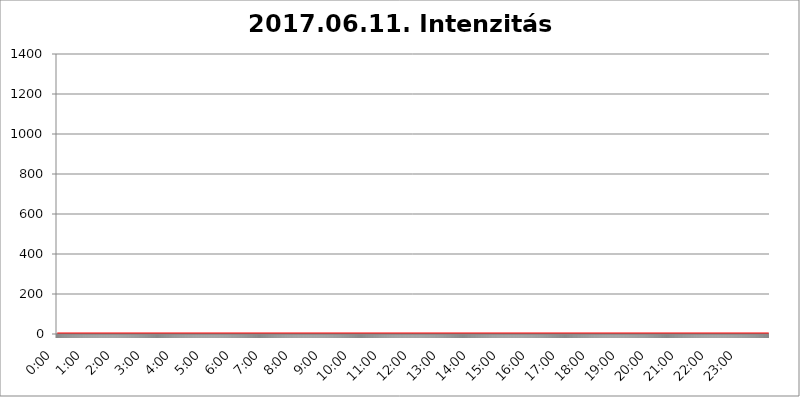
| Category | 2017.06.11. Intenzitás [W/m^2]04 |
|---|---|
| 0.0 | 0 |
| 0.0006944444444444445 | 0 |
| 0.001388888888888889 | 0 |
| 0.0020833333333333333 | 0 |
| 0.002777777777777778 | 0 |
| 0.003472222222222222 | 0 |
| 0.004166666666666667 | 0 |
| 0.004861111111111111 | 0 |
| 0.005555555555555556 | 0 |
| 0.0062499999999999995 | 0 |
| 0.006944444444444444 | 0 |
| 0.007638888888888889 | 0 |
| 0.008333333333333333 | 0 |
| 0.009027777777777779 | 0 |
| 0.009722222222222222 | 0 |
| 0.010416666666666666 | 0 |
| 0.011111111111111112 | 0 |
| 0.011805555555555555 | 0 |
| 0.012499999999999999 | 0 |
| 0.013194444444444444 | 0 |
| 0.013888888888888888 | 0 |
| 0.014583333333333332 | 0 |
| 0.015277777777777777 | 0 |
| 0.015972222222222224 | 0 |
| 0.016666666666666666 | 0 |
| 0.017361111111111112 | 0 |
| 0.018055555555555557 | 0 |
| 0.01875 | 0 |
| 0.019444444444444445 | 0 |
| 0.02013888888888889 | 0 |
| 0.020833333333333332 | 0 |
| 0.02152777777777778 | 0 |
| 0.022222222222222223 | 0 |
| 0.02291666666666667 | 0 |
| 0.02361111111111111 | 0 |
| 0.024305555555555556 | 0 |
| 0.024999999999999998 | 0 |
| 0.025694444444444447 | 0 |
| 0.02638888888888889 | 0 |
| 0.027083333333333334 | 0 |
| 0.027777777777777776 | 0 |
| 0.02847222222222222 | 0 |
| 0.029166666666666664 | 0 |
| 0.029861111111111113 | 0 |
| 0.030555555555555555 | 0 |
| 0.03125 | 0 |
| 0.03194444444444445 | 0 |
| 0.03263888888888889 | 0 |
| 0.03333333333333333 | 0 |
| 0.034027777777777775 | 0 |
| 0.034722222222222224 | 0 |
| 0.035416666666666666 | 0 |
| 0.036111111111111115 | 0 |
| 0.03680555555555556 | 0 |
| 0.0375 | 0 |
| 0.03819444444444444 | 0 |
| 0.03888888888888889 | 0 |
| 0.03958333333333333 | 0 |
| 0.04027777777777778 | 0 |
| 0.04097222222222222 | 0 |
| 0.041666666666666664 | 0 |
| 0.042361111111111106 | 0 |
| 0.04305555555555556 | 0 |
| 0.043750000000000004 | 0 |
| 0.044444444444444446 | 0 |
| 0.04513888888888889 | 0 |
| 0.04583333333333334 | 0 |
| 0.04652777777777778 | 0 |
| 0.04722222222222222 | 0 |
| 0.04791666666666666 | 0 |
| 0.04861111111111111 | 0 |
| 0.049305555555555554 | 0 |
| 0.049999999999999996 | 0 |
| 0.05069444444444445 | 0 |
| 0.051388888888888894 | 0 |
| 0.052083333333333336 | 0 |
| 0.05277777777777778 | 0 |
| 0.05347222222222222 | 0 |
| 0.05416666666666667 | 0 |
| 0.05486111111111111 | 0 |
| 0.05555555555555555 | 0 |
| 0.05625 | 0 |
| 0.05694444444444444 | 0 |
| 0.057638888888888885 | 0 |
| 0.05833333333333333 | 0 |
| 0.05902777777777778 | 0 |
| 0.059722222222222225 | 0 |
| 0.06041666666666667 | 0 |
| 0.061111111111111116 | 0 |
| 0.06180555555555556 | 0 |
| 0.0625 | 0 |
| 0.06319444444444444 | 0 |
| 0.06388888888888888 | 0 |
| 0.06458333333333334 | 0 |
| 0.06527777777777778 | 0 |
| 0.06597222222222222 | 0 |
| 0.06666666666666667 | 0 |
| 0.06736111111111111 | 0 |
| 0.06805555555555555 | 0 |
| 0.06874999999999999 | 0 |
| 0.06944444444444443 | 0 |
| 0.07013888888888889 | 0 |
| 0.07083333333333333 | 0 |
| 0.07152777777777779 | 0 |
| 0.07222222222222223 | 0 |
| 0.07291666666666667 | 0 |
| 0.07361111111111111 | 0 |
| 0.07430555555555556 | 0 |
| 0.075 | 0 |
| 0.07569444444444444 | 0 |
| 0.0763888888888889 | 0 |
| 0.07708333333333334 | 0 |
| 0.07777777777777778 | 0 |
| 0.07847222222222222 | 0 |
| 0.07916666666666666 | 0 |
| 0.0798611111111111 | 0 |
| 0.08055555555555556 | 0 |
| 0.08125 | 0 |
| 0.08194444444444444 | 0 |
| 0.08263888888888889 | 0 |
| 0.08333333333333333 | 0 |
| 0.08402777777777777 | 0 |
| 0.08472222222222221 | 0 |
| 0.08541666666666665 | 0 |
| 0.08611111111111112 | 0 |
| 0.08680555555555557 | 0 |
| 0.08750000000000001 | 0 |
| 0.08819444444444445 | 0 |
| 0.08888888888888889 | 0 |
| 0.08958333333333333 | 0 |
| 0.09027777777777778 | 0 |
| 0.09097222222222222 | 0 |
| 0.09166666666666667 | 0 |
| 0.09236111111111112 | 0 |
| 0.09305555555555556 | 0 |
| 0.09375 | 0 |
| 0.09444444444444444 | 0 |
| 0.09513888888888888 | 0 |
| 0.09583333333333333 | 0 |
| 0.09652777777777777 | 0 |
| 0.09722222222222222 | 0 |
| 0.09791666666666667 | 0 |
| 0.09861111111111111 | 0 |
| 0.09930555555555555 | 0 |
| 0.09999999999999999 | 0 |
| 0.10069444444444443 | 0 |
| 0.1013888888888889 | 0 |
| 0.10208333333333335 | 0 |
| 0.10277777777777779 | 0 |
| 0.10347222222222223 | 0 |
| 0.10416666666666667 | 0 |
| 0.10486111111111111 | 0 |
| 0.10555555555555556 | 0 |
| 0.10625 | 0 |
| 0.10694444444444444 | 0 |
| 0.1076388888888889 | 0 |
| 0.10833333333333334 | 0 |
| 0.10902777777777778 | 0 |
| 0.10972222222222222 | 0 |
| 0.1111111111111111 | 0 |
| 0.11180555555555556 | 0 |
| 0.11180555555555556 | 0 |
| 0.1125 | 0 |
| 0.11319444444444444 | 0 |
| 0.11388888888888889 | 0 |
| 0.11458333333333333 | 0 |
| 0.11527777777777777 | 0 |
| 0.11597222222222221 | 0 |
| 0.11666666666666665 | 0 |
| 0.1173611111111111 | 0 |
| 0.11805555555555557 | 0 |
| 0.11944444444444445 | 0 |
| 0.12013888888888889 | 0 |
| 0.12083333333333333 | 0 |
| 0.12152777777777778 | 0 |
| 0.12222222222222223 | 0 |
| 0.12291666666666667 | 0 |
| 0.12291666666666667 | 0 |
| 0.12361111111111112 | 0 |
| 0.12430555555555556 | 0 |
| 0.125 | 0 |
| 0.12569444444444444 | 0 |
| 0.12638888888888888 | 0 |
| 0.12708333333333333 | 0 |
| 0.16875 | 0 |
| 0.12847222222222224 | 0 |
| 0.12916666666666668 | 0 |
| 0.12986111111111112 | 0 |
| 0.13055555555555556 | 0 |
| 0.13125 | 0 |
| 0.13194444444444445 | 0 |
| 0.1326388888888889 | 0 |
| 0.13333333333333333 | 0 |
| 0.13402777777777777 | 0 |
| 0.13402777777777777 | 0 |
| 0.13472222222222222 | 0 |
| 0.13541666666666666 | 0 |
| 0.1361111111111111 | 0 |
| 0.13749999999999998 | 0 |
| 0.13819444444444443 | 0 |
| 0.1388888888888889 | 0 |
| 0.13958333333333334 | 0 |
| 0.14027777777777778 | 0 |
| 0.14097222222222222 | 0 |
| 0.14166666666666666 | 0 |
| 0.1423611111111111 | 0 |
| 0.14305555555555557 | 0 |
| 0.14375000000000002 | 0 |
| 0.14444444444444446 | 0 |
| 0.1451388888888889 | 0 |
| 0.1451388888888889 | 0 |
| 0.14652777777777778 | 0 |
| 0.14722222222222223 | 0 |
| 0.14791666666666667 | 0 |
| 0.1486111111111111 | 0 |
| 0.14930555555555555 | 0 |
| 0.15 | 0 |
| 0.15069444444444444 | 0 |
| 0.15138888888888888 | 0 |
| 0.15208333333333332 | 0 |
| 0.15277777777777776 | 0 |
| 0.15347222222222223 | 0 |
| 0.15416666666666667 | 0 |
| 0.15486111111111112 | 0 |
| 0.15555555555555556 | 0 |
| 0.15625 | 0 |
| 0.15694444444444444 | 0 |
| 0.15763888888888888 | 0 |
| 0.15833333333333333 | 0 |
| 0.15902777777777777 | 0 |
| 0.15972222222222224 | 0 |
| 0.16041666666666668 | 0 |
| 0.16111111111111112 | 0 |
| 0.16180555555555556 | 0 |
| 0.1625 | 0 |
| 0.16319444444444445 | 0 |
| 0.1638888888888889 | 0 |
| 0.16458333333333333 | 0 |
| 0.16527777777777777 | 0 |
| 0.16597222222222222 | 0 |
| 0.16666666666666666 | 0 |
| 0.1673611111111111 | 0 |
| 0.16805555555555554 | 0 |
| 0.16874999999999998 | 0 |
| 0.16944444444444443 | 0 |
| 0.17013888888888887 | 0 |
| 0.1708333333333333 | 0 |
| 0.17152777777777775 | 0 |
| 0.17222222222222225 | 0 |
| 0.1729166666666667 | 0 |
| 0.17361111111111113 | 0 |
| 0.17430555555555557 | 0 |
| 0.17500000000000002 | 0 |
| 0.17569444444444446 | 0 |
| 0.1763888888888889 | 0 |
| 0.17708333333333334 | 0 |
| 0.17777777777777778 | 0 |
| 0.17847222222222223 | 0 |
| 0.17916666666666667 | 0 |
| 0.1798611111111111 | 0 |
| 0.18055555555555555 | 0 |
| 0.18125 | 0 |
| 0.18194444444444444 | 0 |
| 0.1826388888888889 | 0 |
| 0.18333333333333335 | 0 |
| 0.1840277777777778 | 0 |
| 0.18472222222222223 | 0 |
| 0.18541666666666667 | 0 |
| 0.18611111111111112 | 0 |
| 0.18680555555555556 | 0 |
| 0.1875 | 0 |
| 0.18819444444444444 | 0 |
| 0.18888888888888888 | 0 |
| 0.18958333333333333 | 0 |
| 0.19027777777777777 | 0 |
| 0.1909722222222222 | 0 |
| 0.19166666666666665 | 0 |
| 0.19236111111111112 | 0 |
| 0.19305555555555554 | 0 |
| 0.19375 | 0 |
| 0.19444444444444445 | 0 |
| 0.1951388888888889 | 0 |
| 0.19583333333333333 | 0 |
| 0.19652777777777777 | 0 |
| 0.19722222222222222 | 0 |
| 0.19791666666666666 | 0 |
| 0.1986111111111111 | 0 |
| 0.19930555555555554 | 0 |
| 0.19999999999999998 | 0 |
| 0.20069444444444443 | 0 |
| 0.20138888888888887 | 0 |
| 0.2020833333333333 | 0 |
| 0.2027777777777778 | 0 |
| 0.2034722222222222 | 0 |
| 0.2041666666666667 | 0 |
| 0.20486111111111113 | 0 |
| 0.20555555555555557 | 0 |
| 0.20625000000000002 | 0 |
| 0.20694444444444446 | 0 |
| 0.2076388888888889 | 0 |
| 0.20833333333333334 | 0 |
| 0.20902777777777778 | 0 |
| 0.20972222222222223 | 0 |
| 0.21041666666666667 | 0 |
| 0.2111111111111111 | 0 |
| 0.21180555555555555 | 0 |
| 0.2125 | 0 |
| 0.21319444444444444 | 0 |
| 0.2138888888888889 | 0 |
| 0.21458333333333335 | 0 |
| 0.2152777777777778 | 0 |
| 0.21597222222222223 | 0 |
| 0.21666666666666667 | 0 |
| 0.21736111111111112 | 0 |
| 0.21805555555555556 | 0 |
| 0.21875 | 0 |
| 0.21944444444444444 | 0 |
| 0.22013888888888888 | 0 |
| 0.22083333333333333 | 0 |
| 0.22152777777777777 | 0 |
| 0.2222222222222222 | 0 |
| 0.22291666666666665 | 0 |
| 0.2236111111111111 | 0 |
| 0.22430555555555556 | 0 |
| 0.225 | 0 |
| 0.22569444444444445 | 0 |
| 0.2263888888888889 | 0 |
| 0.22708333333333333 | 0 |
| 0.22777777777777777 | 0 |
| 0.22847222222222222 | 0 |
| 0.22916666666666666 | 0 |
| 0.2298611111111111 | 0 |
| 0.23055555555555554 | 0 |
| 0.23124999999999998 | 0 |
| 0.23194444444444443 | 0 |
| 0.23263888888888887 | 0 |
| 0.2333333333333333 | 0 |
| 0.2340277777777778 | 0 |
| 0.2347222222222222 | 0 |
| 0.2354166666666667 | 0 |
| 0.23611111111111113 | 0 |
| 0.23680555555555557 | 0 |
| 0.23750000000000002 | 0 |
| 0.23819444444444446 | 0 |
| 0.2388888888888889 | 0 |
| 0.23958333333333334 | 0 |
| 0.24027777777777778 | 0 |
| 0.24097222222222223 | 0 |
| 0.24166666666666667 | 0 |
| 0.2423611111111111 | 0 |
| 0.24305555555555555 | 0 |
| 0.24375 | 0 |
| 0.24444444444444446 | 0 |
| 0.24513888888888888 | 0 |
| 0.24583333333333335 | 0 |
| 0.2465277777777778 | 0 |
| 0.24722222222222223 | 0 |
| 0.24791666666666667 | 0 |
| 0.24861111111111112 | 0 |
| 0.24930555555555556 | 0 |
| 0.25 | 0 |
| 0.25069444444444444 | 0 |
| 0.2513888888888889 | 0 |
| 0.2520833333333333 | 0 |
| 0.25277777777777777 | 0 |
| 0.2534722222222222 | 0 |
| 0.25416666666666665 | 0 |
| 0.2548611111111111 | 0 |
| 0.2555555555555556 | 0 |
| 0.25625000000000003 | 0 |
| 0.2569444444444445 | 0 |
| 0.2576388888888889 | 0 |
| 0.25833333333333336 | 0 |
| 0.2590277777777778 | 0 |
| 0.25972222222222224 | 0 |
| 0.2604166666666667 | 0 |
| 0.2611111111111111 | 0 |
| 0.26180555555555557 | 0 |
| 0.2625 | 0 |
| 0.26319444444444445 | 0 |
| 0.2638888888888889 | 0 |
| 0.26458333333333334 | 0 |
| 0.2652777777777778 | 0 |
| 0.2659722222222222 | 0 |
| 0.26666666666666666 | 0 |
| 0.2673611111111111 | 0 |
| 0.26805555555555555 | 0 |
| 0.26875 | 0 |
| 0.26944444444444443 | 0 |
| 0.2701388888888889 | 0 |
| 0.2708333333333333 | 0 |
| 0.27152777777777776 | 0 |
| 0.2722222222222222 | 0 |
| 0.27291666666666664 | 0 |
| 0.2736111111111111 | 0 |
| 0.2743055555555555 | 0 |
| 0.27499999999999997 | 0 |
| 0.27569444444444446 | 0 |
| 0.27638888888888885 | 0 |
| 0.27708333333333335 | 0 |
| 0.2777777777777778 | 0 |
| 0.27847222222222223 | 0 |
| 0.2791666666666667 | 0 |
| 0.2798611111111111 | 0 |
| 0.28055555555555556 | 0 |
| 0.28125 | 0 |
| 0.28194444444444444 | 0 |
| 0.2826388888888889 | 0 |
| 0.2833333333333333 | 0 |
| 0.28402777777777777 | 0 |
| 0.2847222222222222 | 0 |
| 0.28541666666666665 | 0 |
| 0.28611111111111115 | 0 |
| 0.28680555555555554 | 0 |
| 0.28750000000000003 | 0 |
| 0.2881944444444445 | 0 |
| 0.2888888888888889 | 0 |
| 0.28958333333333336 | 0 |
| 0.2902777777777778 | 0 |
| 0.29097222222222224 | 0 |
| 0.2916666666666667 | 0 |
| 0.2923611111111111 | 0 |
| 0.29305555555555557 | 0 |
| 0.29375 | 0 |
| 0.29444444444444445 | 0 |
| 0.2951388888888889 | 0 |
| 0.29583333333333334 | 0 |
| 0.2965277777777778 | 0 |
| 0.2972222222222222 | 0 |
| 0.29791666666666666 | 0 |
| 0.2986111111111111 | 0 |
| 0.29930555555555555 | 0 |
| 0.3 | 0 |
| 0.30069444444444443 | 0 |
| 0.3013888888888889 | 0 |
| 0.3020833333333333 | 0 |
| 0.30277777777777776 | 0 |
| 0.3034722222222222 | 0 |
| 0.30416666666666664 | 0 |
| 0.3048611111111111 | 0 |
| 0.3055555555555555 | 0 |
| 0.30624999999999997 | 0 |
| 0.3069444444444444 | 0 |
| 0.3076388888888889 | 0 |
| 0.30833333333333335 | 0 |
| 0.3090277777777778 | 0 |
| 0.30972222222222223 | 0 |
| 0.3104166666666667 | 0 |
| 0.3111111111111111 | 0 |
| 0.31180555555555556 | 0 |
| 0.3125 | 0 |
| 0.31319444444444444 | 0 |
| 0.3138888888888889 | 0 |
| 0.3145833333333333 | 0 |
| 0.31527777777777777 | 0 |
| 0.3159722222222222 | 0 |
| 0.31666666666666665 | 0 |
| 0.31736111111111115 | 0 |
| 0.31805555555555554 | 0 |
| 0.31875000000000003 | 0 |
| 0.3194444444444445 | 0 |
| 0.3201388888888889 | 0 |
| 0.32083333333333336 | 0 |
| 0.3215277777777778 | 0 |
| 0.32222222222222224 | 0 |
| 0.3229166666666667 | 0 |
| 0.3236111111111111 | 0 |
| 0.32430555555555557 | 0 |
| 0.325 | 0 |
| 0.32569444444444445 | 0 |
| 0.3263888888888889 | 0 |
| 0.32708333333333334 | 0 |
| 0.3277777777777778 | 0 |
| 0.3284722222222222 | 0 |
| 0.32916666666666666 | 0 |
| 0.3298611111111111 | 0 |
| 0.33055555555555555 | 0 |
| 0.33125 | 0 |
| 0.33194444444444443 | 0 |
| 0.3326388888888889 | 0 |
| 0.3333333333333333 | 0 |
| 0.3340277777777778 | 0 |
| 0.3347222222222222 | 0 |
| 0.3354166666666667 | 0 |
| 0.3361111111111111 | 0 |
| 0.3368055555555556 | 0 |
| 0.33749999999999997 | 0 |
| 0.33819444444444446 | 0 |
| 0.33888888888888885 | 0 |
| 0.33958333333333335 | 0 |
| 0.34027777777777773 | 0 |
| 0.34097222222222223 | 0 |
| 0.3416666666666666 | 0 |
| 0.3423611111111111 | 0 |
| 0.3430555555555555 | 0 |
| 0.34375 | 0 |
| 0.3444444444444445 | 0 |
| 0.3451388888888889 | 0 |
| 0.3458333333333334 | 0 |
| 0.34652777777777777 | 0 |
| 0.34722222222222227 | 0 |
| 0.34791666666666665 | 0 |
| 0.34861111111111115 | 0 |
| 0.34930555555555554 | 0 |
| 0.35000000000000003 | 0 |
| 0.3506944444444444 | 0 |
| 0.3513888888888889 | 0 |
| 0.3520833333333333 | 0 |
| 0.3527777777777778 | 0 |
| 0.3534722222222222 | 0 |
| 0.3541666666666667 | 0 |
| 0.3548611111111111 | 0 |
| 0.35555555555555557 | 0 |
| 0.35625 | 0 |
| 0.35694444444444445 | 0 |
| 0.3576388888888889 | 0 |
| 0.35833333333333334 | 0 |
| 0.3590277777777778 | 0 |
| 0.3597222222222222 | 0 |
| 0.36041666666666666 | 0 |
| 0.3611111111111111 | 0 |
| 0.36180555555555555 | 0 |
| 0.3625 | 0 |
| 0.36319444444444443 | 0 |
| 0.3638888888888889 | 0 |
| 0.3645833333333333 | 0 |
| 0.3652777777777778 | 0 |
| 0.3659722222222222 | 0 |
| 0.3666666666666667 | 0 |
| 0.3673611111111111 | 0 |
| 0.3680555555555556 | 0 |
| 0.36874999999999997 | 0 |
| 0.36944444444444446 | 0 |
| 0.37013888888888885 | 0 |
| 0.37083333333333335 | 0 |
| 0.37152777777777773 | 0 |
| 0.37222222222222223 | 0 |
| 0.3729166666666666 | 0 |
| 0.3736111111111111 | 0 |
| 0.3743055555555555 | 0 |
| 0.375 | 0 |
| 0.3756944444444445 | 0 |
| 0.3763888888888889 | 0 |
| 0.3770833333333334 | 0 |
| 0.37777777777777777 | 0 |
| 0.37847222222222227 | 0 |
| 0.37916666666666665 | 0 |
| 0.37986111111111115 | 0 |
| 0.38055555555555554 | 0 |
| 0.38125000000000003 | 0 |
| 0.3819444444444444 | 0 |
| 0.3826388888888889 | 0 |
| 0.3833333333333333 | 0 |
| 0.3840277777777778 | 0 |
| 0.3847222222222222 | 0 |
| 0.3854166666666667 | 0 |
| 0.3861111111111111 | 0 |
| 0.38680555555555557 | 0 |
| 0.3875 | 0 |
| 0.38819444444444445 | 0 |
| 0.3888888888888889 | 0 |
| 0.38958333333333334 | 0 |
| 0.3902777777777778 | 0 |
| 0.3909722222222222 | 0 |
| 0.39166666666666666 | 0 |
| 0.3923611111111111 | 0 |
| 0.39305555555555555 | 0 |
| 0.39375 | 0 |
| 0.39444444444444443 | 0 |
| 0.3951388888888889 | 0 |
| 0.3958333333333333 | 0 |
| 0.3965277777777778 | 0 |
| 0.3972222222222222 | 0 |
| 0.3979166666666667 | 0 |
| 0.3986111111111111 | 0 |
| 0.3993055555555556 | 0 |
| 0.39999999999999997 | 0 |
| 0.40069444444444446 | 0 |
| 0.40138888888888885 | 0 |
| 0.40208333333333335 | 0 |
| 0.40277777777777773 | 0 |
| 0.40347222222222223 | 0 |
| 0.4041666666666666 | 0 |
| 0.4048611111111111 | 0 |
| 0.4055555555555555 | 0 |
| 0.40625 | 0 |
| 0.4069444444444445 | 0 |
| 0.4076388888888889 | 0 |
| 0.4083333333333334 | 0 |
| 0.40902777777777777 | 0 |
| 0.40972222222222227 | 0 |
| 0.41041666666666665 | 0 |
| 0.41111111111111115 | 0 |
| 0.41180555555555554 | 0 |
| 0.41250000000000003 | 0 |
| 0.4131944444444444 | 0 |
| 0.4138888888888889 | 0 |
| 0.4145833333333333 | 0 |
| 0.4152777777777778 | 0 |
| 0.4159722222222222 | 0 |
| 0.4166666666666667 | 0 |
| 0.4173611111111111 | 0 |
| 0.41805555555555557 | 0 |
| 0.41875 | 0 |
| 0.41944444444444445 | 0 |
| 0.4201388888888889 | 0 |
| 0.42083333333333334 | 0 |
| 0.4215277777777778 | 0 |
| 0.4222222222222222 | 0 |
| 0.42291666666666666 | 0 |
| 0.4236111111111111 | 0 |
| 0.42430555555555555 | 0 |
| 0.425 | 0 |
| 0.42569444444444443 | 0 |
| 0.4263888888888889 | 0 |
| 0.4270833333333333 | 0 |
| 0.4277777777777778 | 0 |
| 0.4284722222222222 | 0 |
| 0.4291666666666667 | 0 |
| 0.4298611111111111 | 0 |
| 0.4305555555555556 | 0 |
| 0.43124999999999997 | 0 |
| 0.43194444444444446 | 0 |
| 0.43263888888888885 | 0 |
| 0.43333333333333335 | 0 |
| 0.43402777777777773 | 0 |
| 0.43472222222222223 | 0 |
| 0.4354166666666666 | 0 |
| 0.4361111111111111 | 0 |
| 0.4368055555555555 | 0 |
| 0.4375 | 0 |
| 0.4381944444444445 | 0 |
| 0.4388888888888889 | 0 |
| 0.4395833333333334 | 0 |
| 0.44027777777777777 | 0 |
| 0.44097222222222227 | 0 |
| 0.44166666666666665 | 0 |
| 0.44236111111111115 | 0 |
| 0.44305555555555554 | 0 |
| 0.44375000000000003 | 0 |
| 0.4444444444444444 | 0 |
| 0.4451388888888889 | 0 |
| 0.4458333333333333 | 0 |
| 0.4465277777777778 | 0 |
| 0.4472222222222222 | 0 |
| 0.4479166666666667 | 0 |
| 0.4486111111111111 | 0 |
| 0.44930555555555557 | 0 |
| 0.45 | 0 |
| 0.45069444444444445 | 0 |
| 0.4513888888888889 | 0 |
| 0.45208333333333334 | 0 |
| 0.4527777777777778 | 0 |
| 0.4534722222222222 | 0 |
| 0.45416666666666666 | 0 |
| 0.4548611111111111 | 0 |
| 0.45555555555555555 | 0 |
| 0.45625 | 0 |
| 0.45694444444444443 | 0 |
| 0.4576388888888889 | 0 |
| 0.4583333333333333 | 0 |
| 0.4590277777777778 | 0 |
| 0.4597222222222222 | 0 |
| 0.4604166666666667 | 0 |
| 0.4611111111111111 | 0 |
| 0.4618055555555556 | 0 |
| 0.46249999999999997 | 0 |
| 0.46319444444444446 | 0 |
| 0.46388888888888885 | 0 |
| 0.46458333333333335 | 0 |
| 0.46527777777777773 | 0 |
| 0.46597222222222223 | 0 |
| 0.4666666666666666 | 0 |
| 0.4673611111111111 | 0 |
| 0.4680555555555555 | 0 |
| 0.46875 | 0 |
| 0.4694444444444445 | 0 |
| 0.4701388888888889 | 0 |
| 0.4708333333333334 | 0 |
| 0.47152777777777777 | 0 |
| 0.47222222222222227 | 0 |
| 0.47291666666666665 | 0 |
| 0.47361111111111115 | 0 |
| 0.47430555555555554 | 0 |
| 0.47500000000000003 | 0 |
| 0.4756944444444444 | 0 |
| 0.4763888888888889 | 0 |
| 0.4770833333333333 | 0 |
| 0.4777777777777778 | 0 |
| 0.4784722222222222 | 0 |
| 0.4791666666666667 | 0 |
| 0.4798611111111111 | 0 |
| 0.48055555555555557 | 0 |
| 0.48125 | 0 |
| 0.48194444444444445 | 0 |
| 0.4826388888888889 | 0 |
| 0.48333333333333334 | 0 |
| 0.4840277777777778 | 0 |
| 0.4847222222222222 | 0 |
| 0.48541666666666666 | 0 |
| 0.4861111111111111 | 0 |
| 0.48680555555555555 | 0 |
| 0.4875 | 0 |
| 0.48819444444444443 | 0 |
| 0.4888888888888889 | 0 |
| 0.4895833333333333 | 0 |
| 0.4902777777777778 | 0 |
| 0.4909722222222222 | 0 |
| 0.4916666666666667 | 0 |
| 0.4923611111111111 | 0 |
| 0.4930555555555556 | 0 |
| 0.49374999999999997 | 0 |
| 0.49444444444444446 | 0 |
| 0.49513888888888885 | 0 |
| 0.49583333333333335 | 0 |
| 0.49652777777777773 | 0 |
| 0.49722222222222223 | 0 |
| 0.4979166666666666 | 0 |
| 0.4986111111111111 | 0 |
| 0.4993055555555555 | 0 |
| 0.5 | 0 |
| 0.5006944444444444 | 0 |
| 0.5013888888888889 | 0 |
| 0.5020833333333333 | 0 |
| 0.5027777777777778 | 0 |
| 0.5034722222222222 | 0 |
| 0.5041666666666667 | 0 |
| 0.5048611111111111 | 0 |
| 0.5055555555555555 | 0 |
| 0.50625 | 0 |
| 0.5069444444444444 | 0 |
| 0.5076388888888889 | 0 |
| 0.5083333333333333 | 0 |
| 0.5090277777777777 | 0 |
| 0.5097222222222222 | 0 |
| 0.5104166666666666 | 0 |
| 0.5111111111111112 | 0 |
| 0.5118055555555555 | 0 |
| 0.5125000000000001 | 0 |
| 0.5131944444444444 | 0 |
| 0.513888888888889 | 0 |
| 0.5145833333333333 | 0 |
| 0.5152777777777778 | 0 |
| 0.5159722222222222 | 0 |
| 0.5166666666666667 | 0 |
| 0.517361111111111 | 0 |
| 0.5180555555555556 | 0 |
| 0.5187499999999999 | 0 |
| 0.5194444444444445 | 0 |
| 0.5201388888888888 | 0 |
| 0.5208333333333334 | 0 |
| 0.5215277777777778 | 0 |
| 0.5222222222222223 | 0 |
| 0.5229166666666667 | 0 |
| 0.5236111111111111 | 0 |
| 0.5243055555555556 | 0 |
| 0.525 | 0 |
| 0.5256944444444445 | 0 |
| 0.5263888888888889 | 0 |
| 0.5270833333333333 | 0 |
| 0.5277777777777778 | 0 |
| 0.5284722222222222 | 0 |
| 0.5291666666666667 | 0 |
| 0.5298611111111111 | 0 |
| 0.5305555555555556 | 0 |
| 0.53125 | 0 |
| 0.5319444444444444 | 0 |
| 0.5326388888888889 | 0 |
| 0.5333333333333333 | 0 |
| 0.5340277777777778 | 0 |
| 0.5347222222222222 | 0 |
| 0.5354166666666667 | 0 |
| 0.5361111111111111 | 0 |
| 0.5368055555555555 | 0 |
| 0.5375 | 0 |
| 0.5381944444444444 | 0 |
| 0.5388888888888889 | 0 |
| 0.5395833333333333 | 0 |
| 0.5402777777777777 | 0 |
| 0.5409722222222222 | 0 |
| 0.5416666666666666 | 0 |
| 0.5423611111111112 | 0 |
| 0.5430555555555555 | 0 |
| 0.5437500000000001 | 0 |
| 0.5444444444444444 | 0 |
| 0.545138888888889 | 0 |
| 0.5458333333333333 | 0 |
| 0.5465277777777778 | 0 |
| 0.5472222222222222 | 0 |
| 0.5479166666666667 | 0 |
| 0.548611111111111 | 0 |
| 0.5493055555555556 | 0 |
| 0.5499999999999999 | 0 |
| 0.5506944444444445 | 0 |
| 0.5513888888888888 | 0 |
| 0.5520833333333334 | 0 |
| 0.5527777777777778 | 0 |
| 0.5534722222222223 | 0 |
| 0.5541666666666667 | 0 |
| 0.5548611111111111 | 0 |
| 0.5555555555555556 | 0 |
| 0.55625 | 0 |
| 0.5569444444444445 | 0 |
| 0.5576388888888889 | 0 |
| 0.5583333333333333 | 0 |
| 0.5590277777777778 | 0 |
| 0.5597222222222222 | 0 |
| 0.5604166666666667 | 0 |
| 0.5611111111111111 | 0 |
| 0.5618055555555556 | 0 |
| 0.5625 | 0 |
| 0.5631944444444444 | 0 |
| 0.5638888888888889 | 0 |
| 0.5645833333333333 | 0 |
| 0.5652777777777778 | 0 |
| 0.5659722222222222 | 0 |
| 0.5666666666666667 | 0 |
| 0.5673611111111111 | 0 |
| 0.5680555555555555 | 0 |
| 0.56875 | 0 |
| 0.5694444444444444 | 0 |
| 0.5701388888888889 | 0 |
| 0.5708333333333333 | 0 |
| 0.5715277777777777 | 0 |
| 0.5722222222222222 | 0 |
| 0.5729166666666666 | 0 |
| 0.5736111111111112 | 0 |
| 0.5743055555555555 | 0 |
| 0.5750000000000001 | 0 |
| 0.5756944444444444 | 0 |
| 0.576388888888889 | 0 |
| 0.5770833333333333 | 0 |
| 0.5777777777777778 | 0 |
| 0.5784722222222222 | 0 |
| 0.5791666666666667 | 0 |
| 0.579861111111111 | 0 |
| 0.5805555555555556 | 0 |
| 0.5812499999999999 | 0 |
| 0.5819444444444445 | 0 |
| 0.5826388888888888 | 0 |
| 0.5833333333333334 | 0 |
| 0.5840277777777778 | 0 |
| 0.5847222222222223 | 0 |
| 0.5854166666666667 | 0 |
| 0.5861111111111111 | 0 |
| 0.5868055555555556 | 0 |
| 0.5875 | 0 |
| 0.5881944444444445 | 0 |
| 0.5888888888888889 | 0 |
| 0.5895833333333333 | 0 |
| 0.5902777777777778 | 0 |
| 0.5909722222222222 | 0 |
| 0.5916666666666667 | 0 |
| 0.5923611111111111 | 0 |
| 0.5930555555555556 | 0 |
| 0.59375 | 0 |
| 0.5944444444444444 | 0 |
| 0.5951388888888889 | 0 |
| 0.5958333333333333 | 0 |
| 0.5965277777777778 | 0 |
| 0.5972222222222222 | 0 |
| 0.5979166666666667 | 0 |
| 0.5986111111111111 | 0 |
| 0.5993055555555555 | 0 |
| 0.6 | 0 |
| 0.6006944444444444 | 0 |
| 0.6013888888888889 | 0 |
| 0.6020833333333333 | 0 |
| 0.6027777777777777 | 0 |
| 0.6034722222222222 | 0 |
| 0.6041666666666666 | 0 |
| 0.6048611111111112 | 0 |
| 0.6055555555555555 | 0 |
| 0.6062500000000001 | 0 |
| 0.6069444444444444 | 0 |
| 0.607638888888889 | 0 |
| 0.6083333333333333 | 0 |
| 0.6090277777777778 | 0 |
| 0.6097222222222222 | 0 |
| 0.6104166666666667 | 0 |
| 0.611111111111111 | 0 |
| 0.6118055555555556 | 0 |
| 0.6124999999999999 | 0 |
| 0.6131944444444445 | 0 |
| 0.6138888888888888 | 0 |
| 0.6145833333333334 | 0 |
| 0.6152777777777778 | 0 |
| 0.6159722222222223 | 0 |
| 0.6166666666666667 | 0 |
| 0.6173611111111111 | 0 |
| 0.6180555555555556 | 0 |
| 0.61875 | 0 |
| 0.6194444444444445 | 0 |
| 0.6201388888888889 | 0 |
| 0.6208333333333333 | 0 |
| 0.6215277777777778 | 0 |
| 0.6222222222222222 | 0 |
| 0.6229166666666667 | 0 |
| 0.6236111111111111 | 0 |
| 0.6243055555555556 | 0 |
| 0.625 | 0 |
| 0.6256944444444444 | 0 |
| 0.6263888888888889 | 0 |
| 0.6270833333333333 | 0 |
| 0.6277777777777778 | 0 |
| 0.6284722222222222 | 0 |
| 0.6291666666666667 | 0 |
| 0.6298611111111111 | 0 |
| 0.6305555555555555 | 0 |
| 0.63125 | 0 |
| 0.6319444444444444 | 0 |
| 0.6326388888888889 | 0 |
| 0.6333333333333333 | 0 |
| 0.6340277777777777 | 0 |
| 0.6347222222222222 | 0 |
| 0.6354166666666666 | 0 |
| 0.6361111111111112 | 0 |
| 0.6368055555555555 | 0 |
| 0.6375000000000001 | 0 |
| 0.6381944444444444 | 0 |
| 0.638888888888889 | 0 |
| 0.6395833333333333 | 0 |
| 0.6402777777777778 | 0 |
| 0.6409722222222222 | 0 |
| 0.6416666666666667 | 0 |
| 0.642361111111111 | 0 |
| 0.6430555555555556 | 0 |
| 0.6437499999999999 | 0 |
| 0.6444444444444445 | 0 |
| 0.6451388888888888 | 0 |
| 0.6458333333333334 | 0 |
| 0.6465277777777778 | 0 |
| 0.6472222222222223 | 0 |
| 0.6479166666666667 | 0 |
| 0.6486111111111111 | 0 |
| 0.6493055555555556 | 0 |
| 0.65 | 0 |
| 0.6506944444444445 | 0 |
| 0.6513888888888889 | 0 |
| 0.6520833333333333 | 0 |
| 0.6527777777777778 | 0 |
| 0.6534722222222222 | 0 |
| 0.6541666666666667 | 0 |
| 0.6548611111111111 | 0 |
| 0.6555555555555556 | 0 |
| 0.65625 | 0 |
| 0.6569444444444444 | 0 |
| 0.6576388888888889 | 0 |
| 0.6583333333333333 | 0 |
| 0.6590277777777778 | 0 |
| 0.6597222222222222 | 0 |
| 0.6604166666666667 | 0 |
| 0.6611111111111111 | 0 |
| 0.6618055555555555 | 0 |
| 0.6625 | 0 |
| 0.6631944444444444 | 0 |
| 0.6638888888888889 | 0 |
| 0.6645833333333333 | 0 |
| 0.6652777777777777 | 0 |
| 0.6659722222222222 | 0 |
| 0.6666666666666666 | 0 |
| 0.6673611111111111 | 0 |
| 0.6680555555555556 | 0 |
| 0.6687500000000001 | 0 |
| 0.6694444444444444 | 0 |
| 0.6701388888888888 | 0 |
| 0.6708333333333334 | 0 |
| 0.6715277777777778 | 0 |
| 0.6722222222222222 | 0 |
| 0.6729166666666666 | 0 |
| 0.6736111111111112 | 0 |
| 0.6743055555555556 | 0 |
| 0.6749999999999999 | 0 |
| 0.6756944444444444 | 0 |
| 0.6763888888888889 | 0 |
| 0.6770833333333334 | 0 |
| 0.6777777777777777 | 0 |
| 0.6784722222222223 | 0 |
| 0.6791666666666667 | 0 |
| 0.6798611111111111 | 0 |
| 0.6805555555555555 | 0 |
| 0.68125 | 0 |
| 0.6819444444444445 | 0 |
| 0.6826388888888889 | 0 |
| 0.6833333333333332 | 0 |
| 0.6840277777777778 | 0 |
| 0.6847222222222222 | 0 |
| 0.6854166666666667 | 0 |
| 0.686111111111111 | 0 |
| 0.6868055555555556 | 0 |
| 0.6875 | 0 |
| 0.6881944444444444 | 0 |
| 0.688888888888889 | 0 |
| 0.6895833333333333 | 0 |
| 0.6902777777777778 | 0 |
| 0.6909722222222222 | 0 |
| 0.6916666666666668 | 0 |
| 0.6923611111111111 | 0 |
| 0.6930555555555555 | 0 |
| 0.69375 | 0 |
| 0.6944444444444445 | 0 |
| 0.6951388888888889 | 0 |
| 0.6958333333333333 | 0 |
| 0.6965277777777777 | 0 |
| 0.6972222222222223 | 0 |
| 0.6979166666666666 | 0 |
| 0.6986111111111111 | 0 |
| 0.6993055555555556 | 0 |
| 0.7000000000000001 | 0 |
| 0.7006944444444444 | 0 |
| 0.7013888888888888 | 0 |
| 0.7020833333333334 | 0 |
| 0.7027777777777778 | 0 |
| 0.7034722222222222 | 0 |
| 0.7041666666666666 | 0 |
| 0.7048611111111112 | 0 |
| 0.7055555555555556 | 0 |
| 0.7062499999999999 | 0 |
| 0.7069444444444444 | 0 |
| 0.7076388888888889 | 0 |
| 0.7083333333333334 | 0 |
| 0.7090277777777777 | 0 |
| 0.7097222222222223 | 0 |
| 0.7104166666666667 | 0 |
| 0.7111111111111111 | 0 |
| 0.7118055555555555 | 0 |
| 0.7125 | 0 |
| 0.7131944444444445 | 0 |
| 0.7138888888888889 | 0 |
| 0.7145833333333332 | 0 |
| 0.7152777777777778 | 0 |
| 0.7159722222222222 | 0 |
| 0.7166666666666667 | 0 |
| 0.717361111111111 | 0 |
| 0.7180555555555556 | 0 |
| 0.71875 | 0 |
| 0.7194444444444444 | 0 |
| 0.720138888888889 | 0 |
| 0.7208333333333333 | 0 |
| 0.7215277777777778 | 0 |
| 0.7222222222222222 | 0 |
| 0.7229166666666668 | 0 |
| 0.7236111111111111 | 0 |
| 0.7243055555555555 | 0 |
| 0.725 | 0 |
| 0.7256944444444445 | 0 |
| 0.7263888888888889 | 0 |
| 0.7270833333333333 | 0 |
| 0.7277777777777777 | 0 |
| 0.7284722222222223 | 0 |
| 0.7291666666666666 | 0 |
| 0.7298611111111111 | 0 |
| 0.7305555555555556 | 0 |
| 0.7312500000000001 | 0 |
| 0.7319444444444444 | 0 |
| 0.7326388888888888 | 0 |
| 0.7333333333333334 | 0 |
| 0.7340277777777778 | 0 |
| 0.7347222222222222 | 0 |
| 0.7354166666666666 | 0 |
| 0.7361111111111112 | 0 |
| 0.7368055555555556 | 0 |
| 0.7374999999999999 | 0 |
| 0.7381944444444444 | 0 |
| 0.7388888888888889 | 0 |
| 0.7395833333333334 | 0 |
| 0.7402777777777777 | 0 |
| 0.7409722222222223 | 0 |
| 0.7416666666666667 | 0 |
| 0.7423611111111111 | 0 |
| 0.7430555555555555 | 0 |
| 0.74375 | 0 |
| 0.7444444444444445 | 0 |
| 0.7451388888888889 | 0 |
| 0.7458333333333332 | 0 |
| 0.7465277777777778 | 0 |
| 0.7472222222222222 | 0 |
| 0.7479166666666667 | 0 |
| 0.748611111111111 | 0 |
| 0.7493055555555556 | 0 |
| 0.75 | 0 |
| 0.7506944444444444 | 0 |
| 0.751388888888889 | 0 |
| 0.7520833333333333 | 0 |
| 0.7527777777777778 | 0 |
| 0.7534722222222222 | 0 |
| 0.7541666666666668 | 0 |
| 0.7548611111111111 | 0 |
| 0.7555555555555555 | 0 |
| 0.75625 | 0 |
| 0.7569444444444445 | 0 |
| 0.7576388888888889 | 0 |
| 0.7583333333333333 | 0 |
| 0.7590277777777777 | 0 |
| 0.7597222222222223 | 0 |
| 0.7604166666666666 | 0 |
| 0.7611111111111111 | 0 |
| 0.7618055555555556 | 0 |
| 0.7625000000000001 | 0 |
| 0.7631944444444444 | 0 |
| 0.7638888888888888 | 0 |
| 0.7645833333333334 | 0 |
| 0.7652777777777778 | 0 |
| 0.7659722222222222 | 0 |
| 0.7666666666666666 | 0 |
| 0.7673611111111112 | 0 |
| 0.7680555555555556 | 0 |
| 0.7687499999999999 | 0 |
| 0.7694444444444444 | 0 |
| 0.7701388888888889 | 0 |
| 0.7708333333333334 | 0 |
| 0.7715277777777777 | 0 |
| 0.7722222222222223 | 0 |
| 0.7729166666666667 | 0 |
| 0.7736111111111111 | 0 |
| 0.7743055555555555 | 0 |
| 0.775 | 0 |
| 0.7756944444444445 | 0 |
| 0.7763888888888889 | 0 |
| 0.7770833333333332 | 0 |
| 0.7777777777777778 | 0 |
| 0.7784722222222222 | 0 |
| 0.7791666666666667 | 0 |
| 0.779861111111111 | 0 |
| 0.7805555555555556 | 0 |
| 0.78125 | 0 |
| 0.7819444444444444 | 0 |
| 0.782638888888889 | 0 |
| 0.7833333333333333 | 0 |
| 0.7840277777777778 | 0 |
| 0.7847222222222222 | 0 |
| 0.7854166666666668 | 0 |
| 0.7861111111111111 | 0 |
| 0.7868055555555555 | 0 |
| 0.7875 | 0 |
| 0.7881944444444445 | 0 |
| 0.7888888888888889 | 0 |
| 0.7895833333333333 | 0 |
| 0.7902777777777777 | 0 |
| 0.7909722222222223 | 0 |
| 0.7916666666666666 | 0 |
| 0.7923611111111111 | 0 |
| 0.7930555555555556 | 0 |
| 0.7937500000000001 | 0 |
| 0.7944444444444444 | 0 |
| 0.7951388888888888 | 0 |
| 0.7958333333333334 | 0 |
| 0.7965277777777778 | 0 |
| 0.7972222222222222 | 0 |
| 0.7979166666666666 | 0 |
| 0.7986111111111112 | 0 |
| 0.7993055555555556 | 0 |
| 0.7999999999999999 | 0 |
| 0.8006944444444444 | 0 |
| 0.8013888888888889 | 0 |
| 0.8020833333333334 | 0 |
| 0.8027777777777777 | 0 |
| 0.8034722222222223 | 0 |
| 0.8041666666666667 | 0 |
| 0.8048611111111111 | 0 |
| 0.8055555555555555 | 0 |
| 0.80625 | 0 |
| 0.8069444444444445 | 0 |
| 0.8076388888888889 | 0 |
| 0.8083333333333332 | 0 |
| 0.8090277777777778 | 0 |
| 0.8097222222222222 | 0 |
| 0.8104166666666667 | 0 |
| 0.811111111111111 | 0 |
| 0.8118055555555556 | 0 |
| 0.8125 | 0 |
| 0.8131944444444444 | 0 |
| 0.813888888888889 | 0 |
| 0.8145833333333333 | 0 |
| 0.8152777777777778 | 0 |
| 0.8159722222222222 | 0 |
| 0.8166666666666668 | 0 |
| 0.8173611111111111 | 0 |
| 0.8180555555555555 | 0 |
| 0.81875 | 0 |
| 0.8194444444444445 | 0 |
| 0.8201388888888889 | 0 |
| 0.8208333333333333 | 0 |
| 0.8215277777777777 | 0 |
| 0.8222222222222223 | 0 |
| 0.8229166666666666 | 0 |
| 0.8236111111111111 | 0 |
| 0.8243055555555556 | 0 |
| 0.8250000000000001 | 0 |
| 0.8256944444444444 | 0 |
| 0.8263888888888888 | 0 |
| 0.8270833333333334 | 0 |
| 0.8277777777777778 | 0 |
| 0.8284722222222222 | 0 |
| 0.8291666666666666 | 0 |
| 0.8298611111111112 | 0 |
| 0.8305555555555556 | 0 |
| 0.8312499999999999 | 0 |
| 0.8319444444444444 | 0 |
| 0.8326388888888889 | 0 |
| 0.8333333333333334 | 0 |
| 0.8340277777777777 | 0 |
| 0.8347222222222223 | 0 |
| 0.8354166666666667 | 0 |
| 0.8361111111111111 | 0 |
| 0.8368055555555555 | 0 |
| 0.8375 | 0 |
| 0.8381944444444445 | 0 |
| 0.8388888888888889 | 0 |
| 0.8395833333333332 | 0 |
| 0.8402777777777778 | 0 |
| 0.8409722222222222 | 0 |
| 0.8416666666666667 | 0 |
| 0.842361111111111 | 0 |
| 0.8430555555555556 | 0 |
| 0.84375 | 0 |
| 0.8444444444444444 | 0 |
| 0.845138888888889 | 0 |
| 0.8458333333333333 | 0 |
| 0.8465277777777778 | 0 |
| 0.8472222222222222 | 0 |
| 0.8479166666666668 | 0 |
| 0.8486111111111111 | 0 |
| 0.8493055555555555 | 0 |
| 0.85 | 0 |
| 0.8506944444444445 | 0 |
| 0.8513888888888889 | 0 |
| 0.8520833333333333 | 0 |
| 0.8527777777777777 | 0 |
| 0.8534722222222223 | 0 |
| 0.8541666666666666 | 0 |
| 0.8548611111111111 | 0 |
| 0.8555555555555556 | 0 |
| 0.8562500000000001 | 0 |
| 0.8569444444444444 | 0 |
| 0.8576388888888888 | 0 |
| 0.8583333333333334 | 0 |
| 0.8590277777777778 | 0 |
| 0.8597222222222222 | 0 |
| 0.8604166666666666 | 0 |
| 0.8611111111111112 | 0 |
| 0.8618055555555556 | 0 |
| 0.8624999999999999 | 0 |
| 0.8631944444444444 | 0 |
| 0.8638888888888889 | 0 |
| 0.8645833333333334 | 0 |
| 0.8652777777777777 | 0 |
| 0.8659722222222223 | 0 |
| 0.8666666666666667 | 0 |
| 0.8673611111111111 | 0 |
| 0.8680555555555555 | 0 |
| 0.86875 | 0 |
| 0.8694444444444445 | 0 |
| 0.8701388888888889 | 0 |
| 0.8708333333333332 | 0 |
| 0.8715277777777778 | 0 |
| 0.8722222222222222 | 0 |
| 0.8729166666666667 | 0 |
| 0.873611111111111 | 0 |
| 0.8743055555555556 | 0 |
| 0.875 | 0 |
| 0.8756944444444444 | 0 |
| 0.876388888888889 | 0 |
| 0.8770833333333333 | 0 |
| 0.8777777777777778 | 0 |
| 0.8784722222222222 | 0 |
| 0.8791666666666668 | 0 |
| 0.8798611111111111 | 0 |
| 0.8805555555555555 | 0 |
| 0.88125 | 0 |
| 0.8819444444444445 | 0 |
| 0.8826388888888889 | 0 |
| 0.8833333333333333 | 0 |
| 0.8840277777777777 | 0 |
| 0.8847222222222223 | 0 |
| 0.8854166666666666 | 0 |
| 0.8861111111111111 | 0 |
| 0.8868055555555556 | 0 |
| 0.8875000000000001 | 0 |
| 0.8881944444444444 | 0 |
| 0.8888888888888888 | 0 |
| 0.8895833333333334 | 0 |
| 0.8902777777777778 | 0 |
| 0.8909722222222222 | 0 |
| 0.8916666666666666 | 0 |
| 0.8923611111111112 | 0 |
| 0.8930555555555556 | 0 |
| 0.8937499999999999 | 0 |
| 0.8944444444444444 | 0 |
| 0.8951388888888889 | 0 |
| 0.8958333333333334 | 0 |
| 0.8965277777777777 | 0 |
| 0.8972222222222223 | 0 |
| 0.8979166666666667 | 0 |
| 0.8986111111111111 | 0 |
| 0.8993055555555555 | 0 |
| 0.9 | 0 |
| 0.9006944444444445 | 0 |
| 0.9013888888888889 | 0 |
| 0.9020833333333332 | 0 |
| 0.9027777777777778 | 0 |
| 0.9034722222222222 | 0 |
| 0.9041666666666667 | 0 |
| 0.904861111111111 | 0 |
| 0.9055555555555556 | 0 |
| 0.90625 | 0 |
| 0.9069444444444444 | 0 |
| 0.907638888888889 | 0 |
| 0.9083333333333333 | 0 |
| 0.9090277777777778 | 0 |
| 0.9097222222222222 | 0 |
| 0.9104166666666668 | 0 |
| 0.9111111111111111 | 0 |
| 0.9118055555555555 | 0 |
| 0.9125 | 0 |
| 0.9131944444444445 | 0 |
| 0.9138888888888889 | 0 |
| 0.9145833333333333 | 0 |
| 0.9152777777777777 | 0 |
| 0.9159722222222223 | 0 |
| 0.9166666666666666 | 0 |
| 0.9173611111111111 | 0 |
| 0.9180555555555556 | 0 |
| 0.9187500000000001 | 0 |
| 0.9194444444444444 | 0 |
| 0.9201388888888888 | 0 |
| 0.9208333333333334 | 0 |
| 0.9215277777777778 | 0 |
| 0.9222222222222222 | 0 |
| 0.9229166666666666 | 0 |
| 0.9236111111111112 | 0 |
| 0.9243055555555556 | 0 |
| 0.9249999999999999 | 0 |
| 0.9256944444444444 | 0 |
| 0.9263888888888889 | 0 |
| 0.9270833333333334 | 0 |
| 0.9277777777777777 | 0 |
| 0.9284722222222223 | 0 |
| 0.9291666666666667 | 0 |
| 0.9298611111111111 | 0 |
| 0.9305555555555555 | 0 |
| 0.93125 | 0 |
| 0.9319444444444445 | 0 |
| 0.9326388888888889 | 0 |
| 0.9333333333333332 | 0 |
| 0.9340277777777778 | 0 |
| 0.9347222222222222 | 0 |
| 0.9354166666666667 | 0 |
| 0.936111111111111 | 0 |
| 0.9368055555555556 | 0 |
| 0.9375 | 0 |
| 0.9381944444444444 | 0 |
| 0.938888888888889 | 0 |
| 0.9395833333333333 | 0 |
| 0.9402777777777778 | 0 |
| 0.9409722222222222 | 0 |
| 0.9416666666666668 | 0 |
| 0.9423611111111111 | 0 |
| 0.9430555555555555 | 0 |
| 0.94375 | 0 |
| 0.9444444444444445 | 0 |
| 0.9451388888888889 | 0 |
| 0.9458333333333333 | 0 |
| 0.9465277777777777 | 0 |
| 0.9472222222222223 | 0 |
| 0.9479166666666666 | 0 |
| 0.9486111111111111 | 0 |
| 0.9493055555555556 | 0 |
| 0.9500000000000001 | 0 |
| 0.9506944444444444 | 0 |
| 0.9513888888888888 | 0 |
| 0.9520833333333334 | 0 |
| 0.9527777777777778 | 0 |
| 0.9534722222222222 | 0 |
| 0.9541666666666666 | 0 |
| 0.9548611111111112 | 0 |
| 0.9555555555555556 | 0 |
| 0.9562499999999999 | 0 |
| 0.9569444444444444 | 0 |
| 0.9576388888888889 | 0 |
| 0.9583333333333334 | 0 |
| 0.9590277777777777 | 0 |
| 0.9597222222222223 | 0 |
| 0.9604166666666667 | 0 |
| 0.9611111111111111 | 0 |
| 0.9618055555555555 | 0 |
| 0.9625 | 0 |
| 0.9631944444444445 | 0 |
| 0.9638888888888889 | 0 |
| 0.9645833333333332 | 0 |
| 0.9652777777777778 | 0 |
| 0.9659722222222222 | 0 |
| 0.9666666666666667 | 0 |
| 0.967361111111111 | 0 |
| 0.9680555555555556 | 0 |
| 0.96875 | 0 |
| 0.9694444444444444 | 0 |
| 0.970138888888889 | 0 |
| 0.9708333333333333 | 0 |
| 0.9715277777777778 | 0 |
| 0.9722222222222222 | 0 |
| 0.9729166666666668 | 0 |
| 0.9736111111111111 | 0 |
| 0.9743055555555555 | 0 |
| 0.975 | 0 |
| 0.9756944444444445 | 0 |
| 0.9763888888888889 | 0 |
| 0.9770833333333333 | 0 |
| 0.9777777777777777 | 0 |
| 0.9784722222222223 | 0 |
| 0.9791666666666666 | 0 |
| 0.9798611111111111 | 0 |
| 0.9805555555555556 | 0 |
| 0.9812500000000001 | 0 |
| 0.9819444444444444 | 0 |
| 0.9826388888888888 | 0 |
| 0.9833333333333334 | 0 |
| 0.9840277777777778 | 0 |
| 0.9847222222222222 | 0 |
| 0.9854166666666666 | 0 |
| 0.9861111111111112 | 0 |
| 0.9868055555555556 | 0 |
| 0.9874999999999999 | 0 |
| 0.9881944444444444 | 0 |
| 0.9888888888888889 | 0 |
| 0.9895833333333334 | 0 |
| 0.9902777777777777 | 0 |
| 0.9909722222222223 | 0 |
| 0.9916666666666667 | 0 |
| 0.9923611111111111 | 0 |
| 0.9930555555555555 | 0 |
| 0.99375 | 0 |
| 0.9944444444444445 | 0 |
| 0.9951388888888889 | 0 |
| 0.9958333333333332 | 0 |
| 0.9965277777777778 | 0 |
| 0.9972222222222222 | 0 |
| 0.9979166666666667 | 0 |
| 0.998611111111111 | 0 |
| 0.9993055555555556 | 0 |